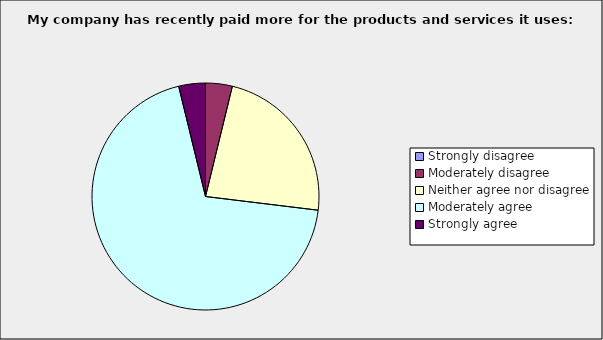
| Category | Series 0 |
|---|---|
| Strongly disagree | 0 |
| Moderately disagree | 0.038 |
| Neither agree nor disagree | 0.231 |
| Moderately agree | 0.692 |
| Strongly agree | 0.038 |